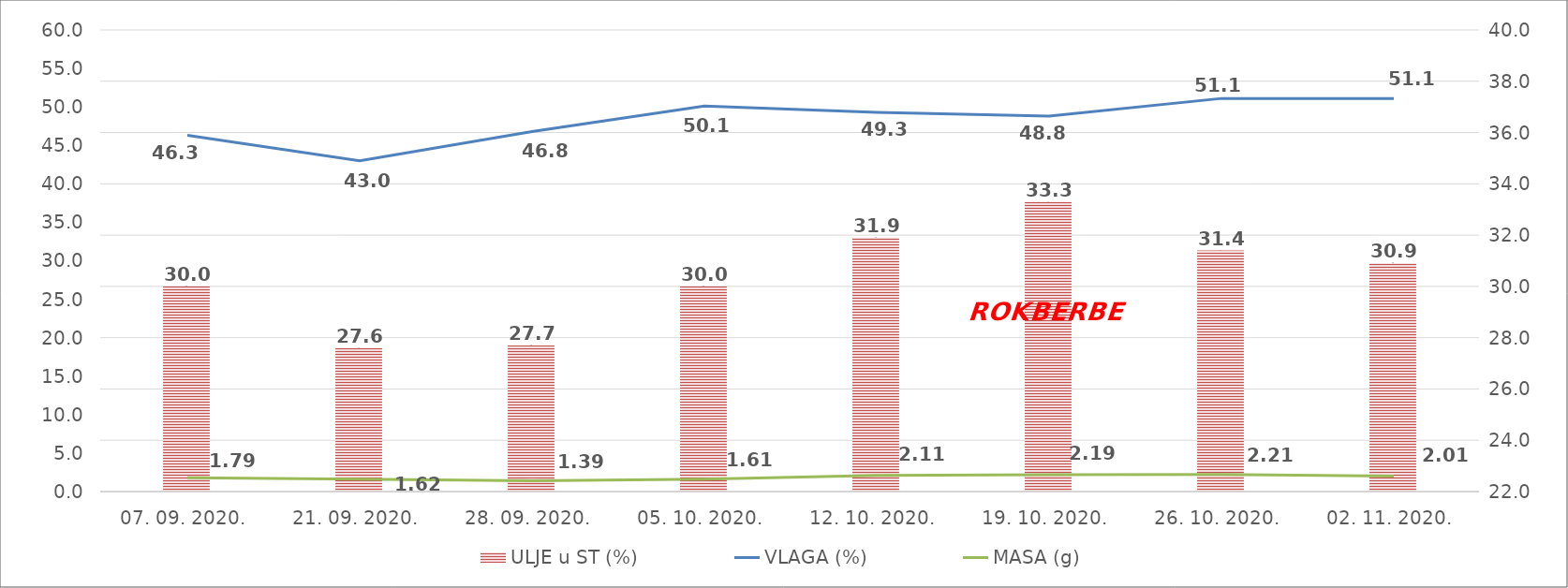
| Category | ULJE u ST (%) |
|---|---|
| 07. 09. 2020. | 30 |
| 21. 09. 2020. | 27.6 |
| 28. 09. 2020. | 27.7 |
| 05. 10. 2020. | 30 |
| 12. 10. 2020. | 31.9 |
| 19. 10. 2020. | 33.3 |
| 26. 10. 2020. | 31.4 |
| 02. 11. 2020. | 30.9 |